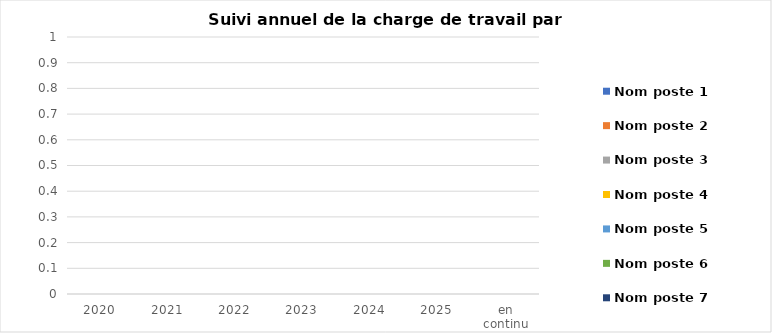
| Category | Nom poste 1 | Nom poste 2 | Nom poste 3 | Nom poste 4 | Nom poste 5 | Nom poste 6 | Nom poste 7 |
|---|---|---|---|---|---|---|---|
| 2020 | 0 | 0 | 0 | 0 | 0 | 0 | 0 |
| 2021 | 0 | 0 | 0 | 0 | 0 | 0 | 0 |
| 2022 | 0 | 0 | 0 | 0 | 0 | 0 | 0 |
| 2023 | 0 | 0 | 0 | 0 | 0 | 0 | 0 |
| 2024 | 0 | 0 | 0 | 0 | 0 | 0 | 0 |
| 2025 | 0 | 0 | 0 | 0 | 0 | 0 | 0 |
| en continu | 0 | 0 | 0 | 0 | 0 | 0 | 0 |